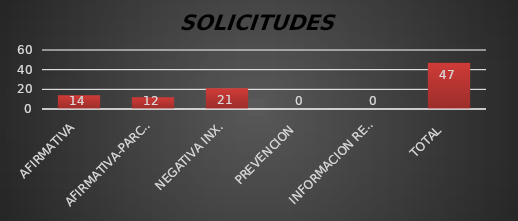
| Category | Series 1 |
|---|---|
| AFIRMATIVA | 14 |
| AFIRMATIVA-PARCIAL | 12 |
| NEGATIVA INX. | 21 |
| PREVENCION  | 0 |
| INFORMACION RESERVADA | 0 |
| TOTAL  | 47 |